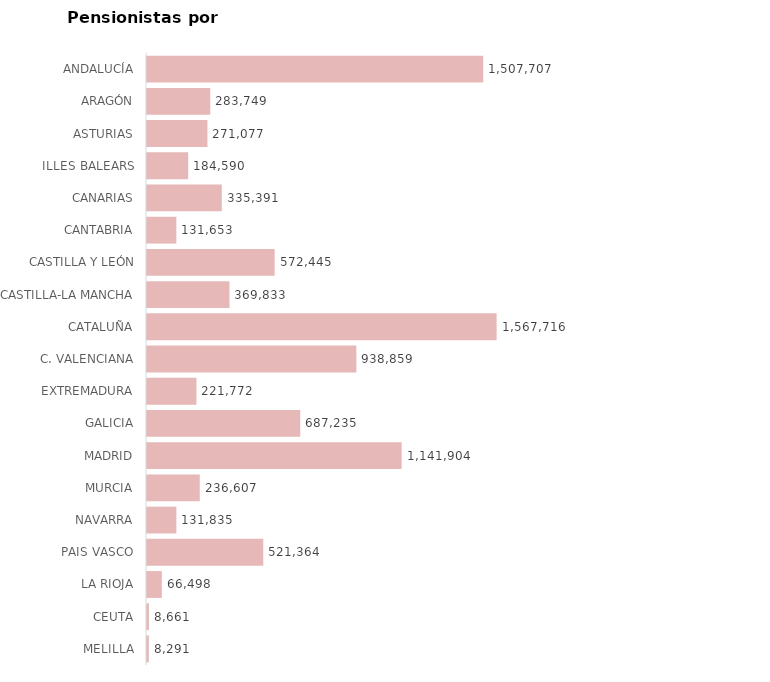
| Category | AMBOS SEXOS (1) |
|---|---|
| ANDALUCÍA | 1507707 |
| ARAGÓN | 283749 |
| ASTURIAS | 271077 |
| ILLES BALEARS | 184590 |
| CANARIAS | 335391 |
| CANTABRIA | 131653 |
| CASTILLA Y LEÓN | 572445 |
| CASTILLA-LA MANCHA | 369833 |
| CATALUÑA | 1567716 |
| C. VALENCIANA | 938859 |
| EXTREMADURA | 221772 |
| GALICIA | 687235 |
| MADRID | 1141904 |
| MURCIA | 236607 |
| NAVARRA | 131835 |
| PAIS VASCO | 521364 |
| LA RIOJA | 66498 |
| CEUTA | 8661 |
| MELILLA | 8291 |